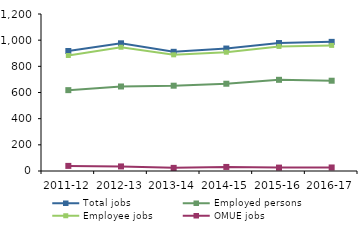
| Category | Total jobs | Employed persons | Employee jobs | OMUE jobs |
|---|---|---|---|---|
| 2011-12 | 917 | 618 | 883 | 39 |
| 2012-13 | 976 | 646 | 946 | 35 |
| 2013-14 | 911 | 652 | 888 | 24 |
| 2014-15 | 936 | 667 | 908 | 31 |
| 2015-16 | 978 | 697 | 952 | 26 |
| 2016-17 | 987 | 690 | 960 | 27 |